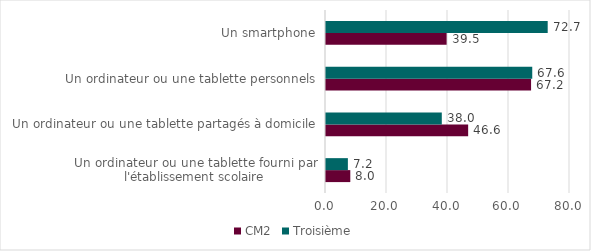
| Category | CM2 | Troisième |
|---|---|---|
| Un ordinateur ou une tablette fourni par l'établissement scolaire | 7.967 | 7.174 |
| Un ordinateur ou une tablette partagés à domicile | 46.608 | 37.966 |
| Un ordinateur ou une tablette personnels | 67.237 | 67.624 |
| Un smartphone | 39.548 | 72.688 |